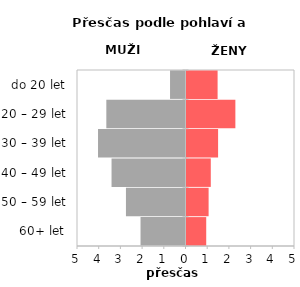
| Category | Přesčas |
|---|---|
| 60+ let | 0.909 |
| 50 – 59 let | 1.019 |
| 40 – 49 let | 1.119 |
| 30 – 39 let | 1.456 |
| 20 – 29 let | 2.252 |
| do 20 let | 1.433 |